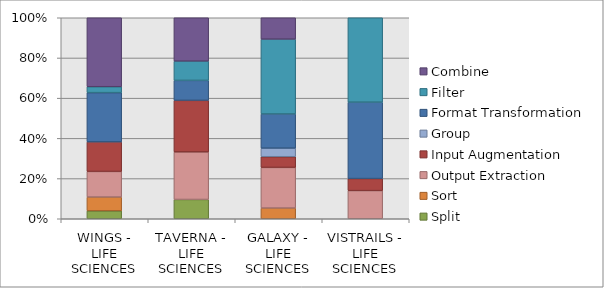
| Category | Split | Sort | Output Extraction | Input Augmentation | Group | Format Transformation | Filter  | Combine |
|---|---|---|---|---|---|---|---|---|
| WINGS - LIFE SCIENCES | 4 | 7 | 13 | 15 | 0 | 25 | 3 | 35 |
| TAVERNA - LIFE SCIENCES | 28 | 0 | 69 | 75 | 0 | 29 | 28 | 63 |
| GALAXY - LIFE SCIENCES | 0 | 5 | 19 | 5 | 4 | 16 | 35 | 10 |
| VISTRAILS - LIFE SCIENCES | 0 | 0 | 7 | 3 | 0 | 19 | 21 | 0 |